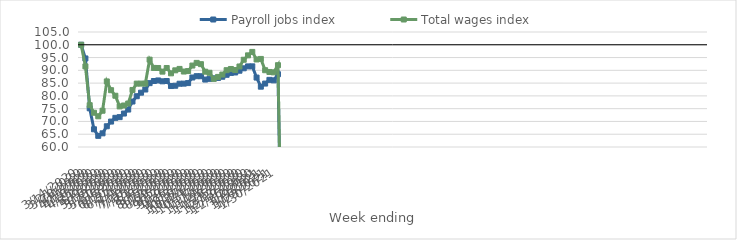
| Category | Payroll jobs index | Total wages index |
|---|---|---|
| 14/03/2020 | 100 | 100 |
| 21/03/2020 | 94.652 | 91.537 |
| 28/03/2020 | 75.141 | 76.374 |
| 04/04/2020 | 66.934 | 73.407 |
| 11/04/2020 | 64.368 | 72.012 |
| 18/04/2020 | 65.35 | 74.196 |
| 25/04/2020 | 68.115 | 85.66 |
| 02/05/2020 | 69.948 | 82.228 |
| 09/05/2020 | 71.413 | 80.06 |
| 16/05/2020 | 71.69 | 75.879 |
| 23/05/2020 | 73.091 | 76.241 |
| 30/05/2020 | 74.651 | 77.01 |
| 06/06/2020 | 77.793 | 82.324 |
| 13/06/2020 | 79.865 | 84.804 |
| 20/06/2020 | 81.256 | 84.807 |
| 27/06/2020 | 82.489 | 84.806 |
| 04/07/2020 | 84.985 | 94.181 |
| 11/07/2020 | 85.822 | 90.944 |
| 18/07/2020 | 86.041 | 90.915 |
| 25/07/2020 | 85.698 | 89.494 |
| 01/08/2020 | 85.825 | 90.916 |
| 08/08/2020 | 83.862 | 88.824 |
| 15/08/2020 | 83.972 | 89.998 |
| 22/08/2020 | 84.759 | 90.558 |
| 29/08/2020 | 84.793 | 89.531 |
| 05/09/2020 | 85.012 | 89.707 |
| 12/09/2020 | 87.19 | 91.868 |
| 19/09/2020 | 87.71 | 92.913 |
| 26/09/2020 | 87.687 | 92.412 |
| 03/10/2020 | 86.389 | 89.467 |
| 10/10/2020 | 86.669 | 89.041 |
| 17/10/2020 | 86.877 | 86.669 |
| 24/10/2020 | 87.028 | 87.426 |
| 31/10/2020 | 87.494 | 88.351 |
| 07/11/2020 | 88.256 | 90.06 |
| 14/11/2020 | 88.985 | 90.533 |
| 21/11/2020 | 89.161 | 90.114 |
| 28/11/2020 | 89.85 | 91.506 |
| 05/12/2020 | 90.793 | 94.139 |
| 12/12/2020 | 91.536 | 95.86 |
| 19/12/2020 | 91.557 | 97.205 |
| 26/12/2020 | 87.167 | 94.247 |
| 02/01/2021 | 83.606 | 94.463 |
| 09/01/2021 | 84.821 | 90.041 |
| 16/01/2021 | 86.271 | 89.36 |
| 23/01/2021 | 86.074 | 89.213 |
| 30/01/2021 | 88.481 | 92.011 |